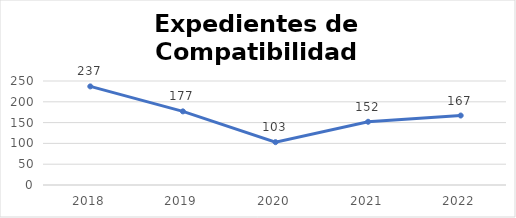
| Category | Expedientes de Compatibilidad |
|---|---|
| 2018.0 | 237 |
| 2019.0 | 177 |
| 2020.0 | 103 |
| 2021.0 | 152 |
| 2022.0 | 167 |